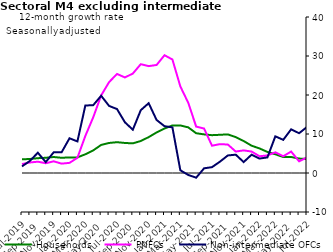
| Category | zero | Households | PNFCs | Non-intermediate OFCs |
|---|---|---|---|---|
| Jul-2019 | 0 | 3.5 | 2.3 | 1.7 |
| Aug-2019 | 0 | 3.6 | 2.7 | 3.1 |
| Sep-2019 | 0 | 3.8 | 2.9 | 5.2 |
| Oct-2019 | 0 | 3.9 | 2.5 | 2.8 |
| Nov-2019 | 0 | 4.1 | 3 | 5.3 |
| Dec-2019 | 0 | 3.9 | 2.4 | 5.3 |
| Jan-2020 | 0 | 4 | 2.6 | 8.9 |
| Feb-2020 | 0 | 4 | 3.9 | 8.1 |
| Mar-2020 | 0 | 4.8 | 9.5 | 17.3 |
| Apr-2020 | 0 | 5.8 | 14.3 | 17.4 |
| May-2020 | 0 | 7.2 | 19.9 | 19.8 |
| Jun-2020 | 0 | 7.7 | 23.3 | 17.2 |
| Jul-2020 | 0 | 7.9 | 25.4 | 16.4 |
| Aug-2020 | 0 | 7.7 | 24.5 | 13 |
| Sep-2020 | 0 | 7.6 | 25.5 | 11.1 |
| Oct-2020 | 0 | 8.2 | 27.9 | 16.1 |
| Nov-2020 | 0 | 9.2 | 27.4 | 17.9 |
| Dec-2020 | 0 | 10.4 | 27.7 | 13.6 |
| Jan-2021 | 0 | 11.4 | 30.2 | 12 |
| Feb-2021 | 0 | 12.2 | 29.1 | 11.7 |
| Mar-2021 | 0 | 12.2 | 22.2 | 0.7 |
| Apr-2021 | 0 | 11.7 | 18 | -0.5 |
| May-2021 | 0 | 10.2 | 11.9 | -1.2 |
| Jun-2021 | 0 | 9.9 | 11.4 | 1.2 |
| Jul-2021 | 0 | 9.7 | 7 | 1.5 |
| Aug-2021 | 0 | 9.8 | 7.4 | 2.9 |
| Sep-2021 | 0 | 9.9 | 7.3 | 4.5 |
| Oct-2021 | 0 | 9.2 | 5.5 | 4.7 |
| Nov-2021 | 0 | 8.2 | 5.8 | 2.8 |
| Dec-2021 | 0 | 7 | 5.5 | 4.7 |
| Jan-2022 | 0 | 6.3 | 4.3 | 3.7 |
| Feb-2022 | 0 | 5.4 | 4.5 | 4 |
| Mar-2022 | 0 | 4.8 | 5.3 | 9.4 |
| Apr-2022 | 0 | 4.1 | 4.3 | 8.5 |
| May-2022 | 0 | 4.1 | 5.5 | 11.2 |
| Jun-2022 | 0 | 3.7 | 3 | 10.2 |
| Jul-2022 | 0 | 3.6 | 4 | 11.8 |